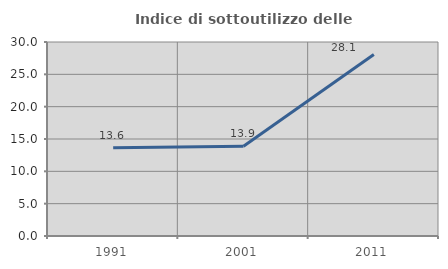
| Category | Indice di sottoutilizzo delle abitazioni  |
|---|---|
| 1991.0 | 13.641 |
| 2001.0 | 13.891 |
| 2011.0 | 28.06 |